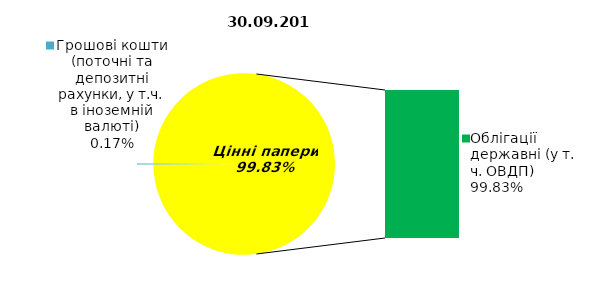
| Category | Series 0 |
|---|---|
| Грошові кошти (поточні та депозитні рахунки, у т.ч. в іноземній валюті) | 0.168 |
| Банківські метали | 0 |
| Нерухомість | 0 |
| Інші активи | 0 |
| Акції | 0 |
| Облігації підприємств | 0 |
| Муніципальні облігації | 0 |
| Облігації державні (у т. ч. ОВДП) | 97.578 |
| Іпотечні сертифікати | 0 |